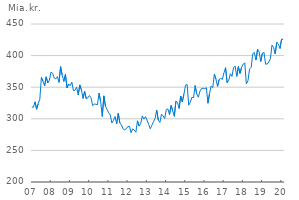
| Category | Indlån i alt (ultimo) |
|---|---|
| 2007-01-01 | 318.869 |
| 2007-02-01 | 318.106 |
| 2007-03-01 | 326.875 |
| 2007-04-01 | 315.142 |
| 2007-05-01 | 324.087 |
| 2007-06-01 | 331.032 |
| 2007-07-01 | 365.399 |
| 2007-08-01 | 359.408 |
| 2007-09-01 | 351.937 |
| 2007-10-01 | 366.509 |
| 2007-11-01 | 356.743 |
| 2007-12-01 | 361.203 |
| 2008-01-01 | 373.939 |
| 2008-02-01 | 371.935 |
| 2008-03-01 | 364.535 |
| 2008-04-01 | 363.215 |
| 2008-05-01 | 366.827 |
| 2008-06-01 | 357.644 |
| 2008-07-01 | 382.572 |
| 2008-08-01 | 368.83 |
| 2008-09-01 | 359.149 |
| 2008-10-01 | 370.134 |
| 2008-11-01 | 348.932 |
| 2008-12-01 | 355.166 |
| 2009-01-01 | 352.395 |
| 2009-02-01 | 358.036 |
| 2009-03-01 | 344.539 |
| 2009-04-01 | 345.266 |
| 2009-05-01 | 350.119 |
| 2009-06-01 | 337.687 |
| 2009-07-01 | 353.606 |
| 2009-08-01 | 345.645 |
| 2009-09-01 | 332.212 |
| 2009-10-01 | 343.339 |
| 2009-11-01 | 331.743 |
| 2009-12-01 | 333.158 |
| 2010-01-01 | 336.747 |
| 2010-02-01 | 333.162 |
| 2010-03-01 | 320.833 |
| 2010-04-01 | 323.328 |
| 2010-05-01 | 322.957 |
| 2010-06-01 | 322.281 |
| 2010-07-01 | 340.62 |
| 2010-08-01 | 327.161 |
| 2010-09-01 | 303.662 |
| 2010-10-01 | 336.281 |
| 2010-11-01 | 319.821 |
| 2010-12-01 | 314.677 |
| 2011-01-01 | 309.659 |
| 2011-02-01 | 306.043 |
| 2011-03-01 | 293.336 |
| 2011-04-01 | 297.504 |
| 2011-05-01 | 303.548 |
| 2011-06-01 | 292.07 |
| 2011-07-01 | 308.692 |
| 2011-08-01 | 293.302 |
| 2011-09-01 | 290.211 |
| 2011-10-01 | 284.138 |
| 2011-11-01 | 282.592 |
| 2011-12-01 | 284.193 |
| 2012-01-01 | 287.865 |
| 2012-02-01 | 288.116 |
| 2012-03-01 | 277.977 |
| 2012-04-01 | 283.992 |
| 2012-05-01 | 281.91 |
| 2012-06-01 | 278.704 |
| 2012-07-01 | 296.82 |
| 2012-08-01 | 288.409 |
| 2012-09-01 | 292.351 |
| 2012-10-01 | 304.565 |
| 2012-11-01 | 299.586 |
| 2012-12-01 | 303.41 |
| 2013-01-01 | 297.812 |
| 2013-02-01 | 290.961 |
| 2013-03-01 | 284.229 |
| 2013-04-01 | 289.884 |
| 2013-05-01 | 295.437 |
| 2013-06-01 | 300.506 |
| 2013-07-01 | 313.846 |
| 2013-08-01 | 297.81 |
| 2013-09-01 | 294.25 |
| 2013-10-01 | 307.344 |
| 2013-11-01 | 304.548 |
| 2013-12-01 | 300.408 |
| 2014-01-01 | 314.855 |
| 2014-02-01 | 315.56 |
| 2014-03-01 | 306.611 |
| 2014-04-01 | 321.118 |
| 2014-05-01 | 312.641 |
| 2014-06-01 | 303.858 |
| 2014-07-01 | 327.894 |
| 2014-08-01 | 326.062 |
| 2014-09-01 | 316.271 |
| 2014-10-01 | 335.953 |
| 2014-11-01 | 326.874 |
| 2014-12-01 | 338.917 |
| 2015-01-01 | 353.207 |
| 2015-02-01 | 354.37 |
| 2015-03-01 | 321.547 |
| 2015-04-01 | 326.223 |
| 2015-05-01 | 334.182 |
| 2015-06-01 | 333.231 |
| 2015-07-01 | 352.657 |
| 2015-08-01 | 339.372 |
| 2015-09-01 | 334.054 |
| 2015-10-01 | 343.701 |
| 2015-11-01 | 347.797 |
| 2015-12-01 | 348.363 |
| 2016-01-01 | 347.575 |
| 2016-02-01 | 349.187 |
| 2016-03-01 | 324.628 |
| 2016-04-01 | 340.157 |
| 2016-05-01 | 351.824 |
| 2016-06-01 | 349.347 |
| 2016-07-01 | 370.488 |
| 2016-08-01 | 362.705 |
| 2016-09-01 | 351.308 |
| 2016-10-01 | 362.302 |
| 2016-11-01 | 363.87 |
| 2016-12-01 | 362.34 |
| 2017-01-01 | 372.757 |
| 2017-02-01 | 380.804 |
| 2017-03-01 | 357.026 |
| 2017-04-01 | 360.984 |
| 2017-05-01 | 371.286 |
| 2017-06-01 | 366.958 |
| 2017-07-01 | 381.297 |
| 2017-08-01 | 383.321 |
| 2017-09-01 | 367.151 |
| 2017-10-01 | 382.521 |
| 2017-11-01 | 371.824 |
| 2017-12-01 | 381.177 |
| 2018-01-01 | 386.536 |
| 2018-02-01 | 388.333 |
| 2018-03-01 | 355.16 |
| 2018-04-01 | 360.309 |
| 2018-05-01 | 378.726 |
| 2018-06-01 | 381.317 |
| 2018-07-01 | 403.084 |
| 2018-08-01 | 404.91 |
| 2018-09-01 | 393.005 |
| 2018-10-01 | 410.019 |
| 2018-11-01 | 405.457 |
| 2018-12-01 | 390.669 |
| 2019-01-01 | 403.785 |
| 2019-02-01 | 405.136 |
| 2019-03-01 | 386.402 |
| 2019-04-01 | 386.664 |
| 2019-05-01 | 389.875 |
| 2019-06-01 | 394.932 |
| 2019-07-01 | 416.67 |
| 2019-08-01 | 412.8 |
| 2019-09-01 | 402.54 |
| 2019-10-01 | 420.978 |
| 2019-11-01 | 418.514 |
| 2019-12-01 | 411.21 |
| 2020-01-01 | 426.206 |
| 2020-02-01 | 425.727 |